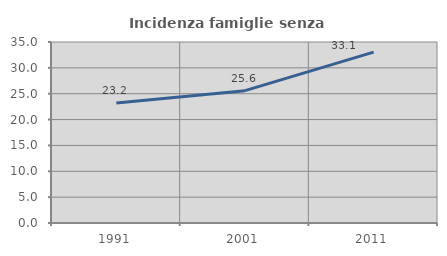
| Category | Incidenza famiglie senza nuclei |
|---|---|
| 1991.0 | 23.198 |
| 2001.0 | 25.591 |
| 2011.0 | 33.053 |